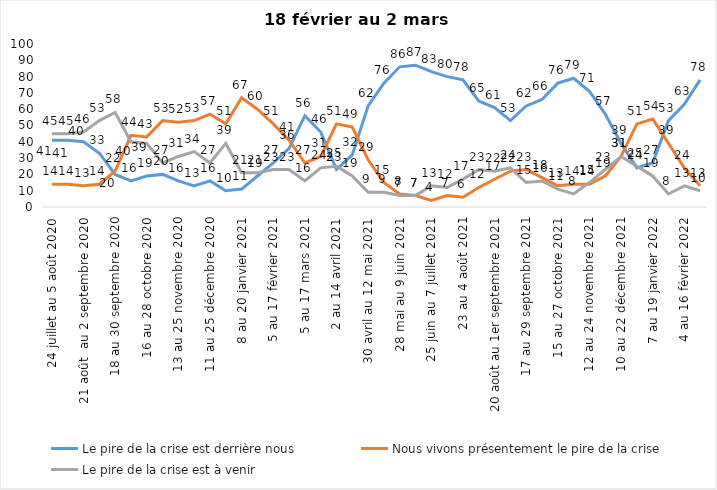
| Category | Le pire de la crise est derrière nous | Nous vivons présentement le pire de la crise | Le pire de la crise est à venir |
|---|---|---|---|
| 24 juillet au 5 août 2020 | 41 | 14 | 45 |
| 7 au 19 août 2020 | 41 | 14 | 45 |
| 21 août  au 2 septembre 2020 | 40 | 13 | 46 |
| 4 au 16 septembre 2020 | 33 | 14 | 53 |
| 18 au 30 septembre 2020 | 20 | 22 | 58 |
| 2 au 14 octobre 2020 | 16 | 44 | 40 |
| 16 au 28 octobre 2020 | 19 | 43 | 39 |
| 30 octobre au 11 novembre 2020 | 20 | 53 | 27 |
| 13 au 25 novembre 2020 | 16 | 52 | 31 |
| 27 au 9 décembre 2020 | 13 | 53 | 34 |
| 11 au 25 décembre 2020 | 16 | 57 | 27 |
| 25 décembre 2020 au 6 janvier 2021 | 10 | 51 | 39 |
| 8 au 20 janvier 2021 | 11 | 67 | 21 |
| 22 janvier au 3 février 2021 | 19 | 60 | 21 |
| 5 au 17 février 2021 | 27 | 51 | 23 |
| 19 février au 3 mars 2021 | 36 | 41 | 23 |
| 5 au 17 mars 2021 | 56 | 27 | 16 |
| 19 au 31 mars 2021 | 46 | 31 | 24 |
| 2 au 14 avril 2021 | 23 | 51 | 25 |
| 16 au 28 avril 2021 | 32 | 49 | 19 |
| 30 avril au 12 mai 2021 | 62 | 29 | 9 |
| 14 au 26 mai 2021 | 76 | 15 | 9 |
| 28 mai au 9 juin 2021 | 86 | 8 | 7 |
| 11 au 23 juin 2021 | 87 | 7 | 7 |
| 25 juin au 7 juillet 2021 | 83 | 4 | 13 |
| 9 au 21 juillet 2021 2021 | 80 | 7 | 12 |
| 23 au 4 août 2021 | 78 | 6 | 17 |
| 6 au 18 août 2021 | 65 | 12 | 23 |
| 20 août au 1er septembre 2021 | 61 | 17 | 22 |
| 3 au 15 septembre 2021 | 53 | 22 | 24 |
| 17 au 29 septembre 2021 | 62 | 23 | 15 |
| 1 au 13 octobre 2021 | 66 | 18 | 16 |
| 15 au 27 octobre 2021 | 76 | 13 | 11 |
| 29 octobre au 10 novembre 2021 | 79 | 14 | 8 |
| 12 au 24 novembre 2021 | 71 | 14 | 15 |
| 26 novembre au 8 décembre 2021 | 57 | 19 | 23 |
| 10 au 22 décembre 2021 | 39 | 31 | 31 |
| 24 décembre 2021 au 5 janvier 2022 2022 | 24 | 51 | 25 |
| 7 au 19 janvier 2022 | 27 | 54 | 19 |
| 21 janvier au 2 février 2022 | 53 | 39 | 8 |
| 4 au 16 février 2022 | 63 | 24 | 13 |
| 18 février au 2 mars  2022 | 78 | 13 | 10 |